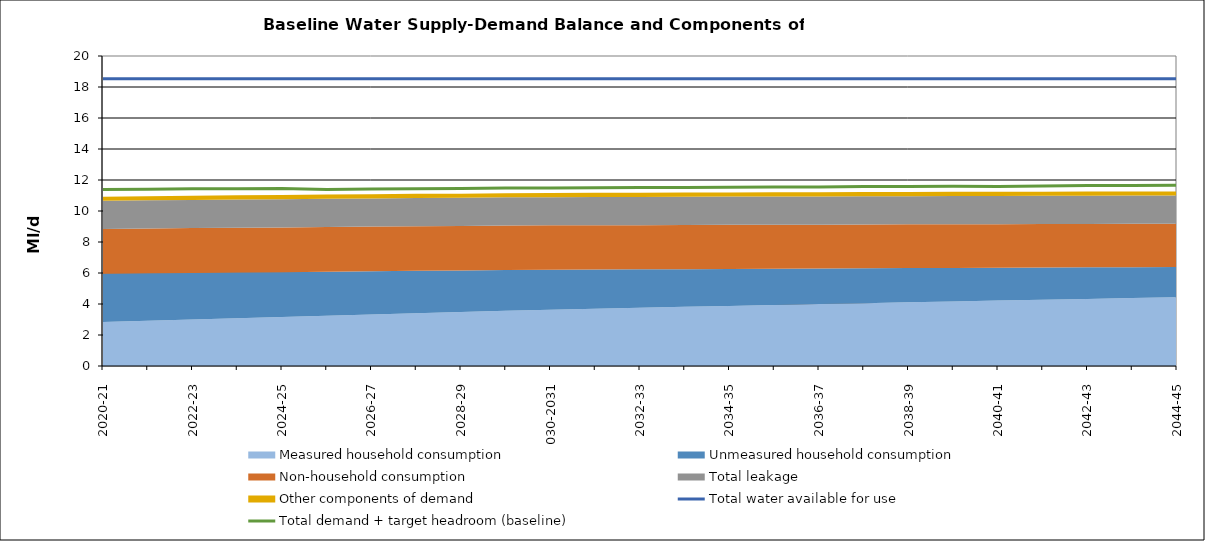
| Category | Total water available for use | Total demand + target headroom (baseline) |
|---|---|---|
| 0 | 18.529 | 11.385 |
| 1 | 18.529 | 11.407 |
| 2 | 18.529 | 11.438 |
| 3 | 18.529 | 11.441 |
| 4 | 18.529 | 11.451 |
| 5 | 18.529 | 11.382 |
| 6 | 18.529 | 11.416 |
| 7 | 18.529 | 11.441 |
| 8 | 18.529 | 11.454 |
| 9 | 18.529 | 11.483 |
| 10 | 18.529 | 11.482 |
| 11 | 18.529 | 11.505 |
| 12 | 18.529 | 11.516 |
| 13 | 18.529 | 11.523 |
| 14 | 18.529 | 11.538 |
| 15 | 18.529 | 11.543 |
| 16 | 18.529 | 11.543 |
| 17 | 18.529 | 11.579 |
| 18 | 18.529 | 11.583 |
| 19 | 18.529 | 11.59 |
| 20 | 18.529 | 11.587 |
| 21 | 18.529 | 11.617 |
| 22 | 18.529 | 11.639 |
| 23 | 18.529 | 11.638 |
| 24 | 18.529 | 11.665 |